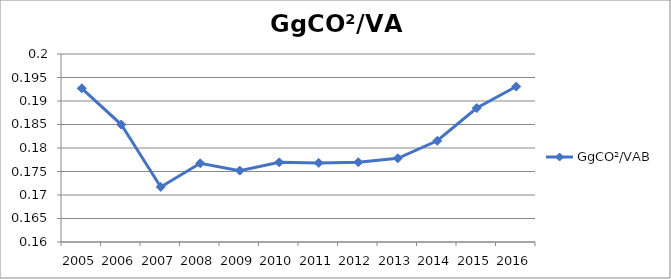
| Category | GgCO²/VAB |
|---|---|
| 2005.0 | 0.193 |
| 2006.0 | 0.185 |
| 2007.0 | 0.172 |
| 2008.0 | 0.177 |
| 2009.0 | 0.175 |
| 2010.0 | 0.177 |
| 2011.0 | 0.177 |
| 2012.0 | 0.177 |
| 2013.0 | 0.178 |
| 2014.0 | 0.182 |
| 2015.0 | 0.189 |
| 2016.0 | 0.193 |